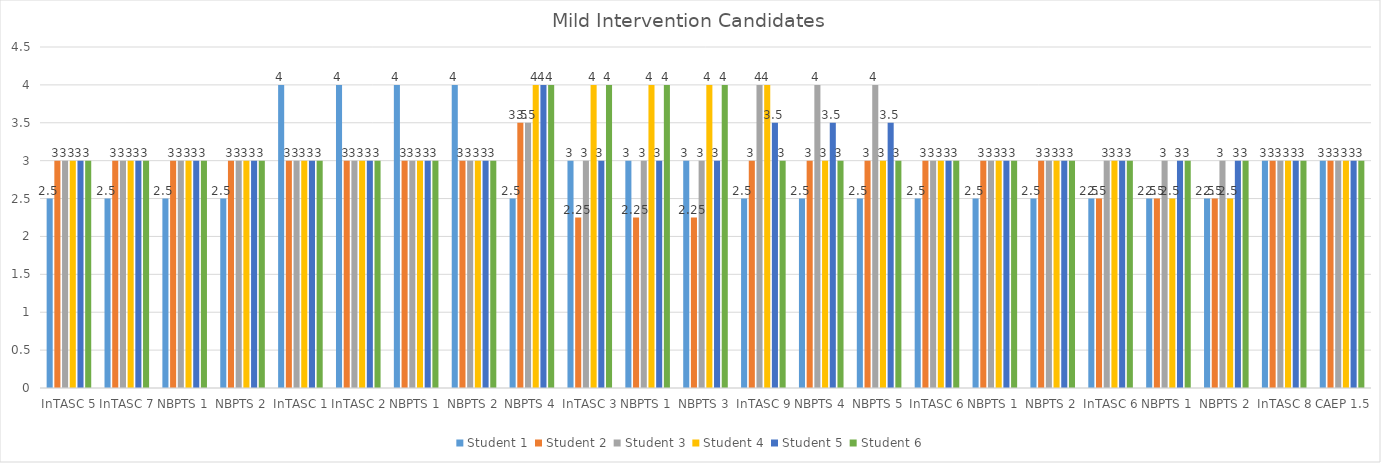
| Category | Student 1 | Student 2 | Student 3 | Student 4 | Student 5 | Student 6 |
|---|---|---|---|---|---|---|
| InTASC 5 | 2.5 | 3 | 3 | 3 | 3 | 3 |
| InTASC 7 | 2.5 | 3 | 3 | 3 | 3 | 3 |
| NBPTS 1 | 2.5 | 3 | 3 | 3 | 3 | 3 |
| NBPTS 2 | 2.5 | 3 | 3 | 3 | 3 | 3 |
| InTASC 1 | 4 | 3 | 3 | 3 | 3 | 3 |
| InTASC 2 | 4 | 3 | 3 | 3 | 3 | 3 |
| NBPTS 1 | 4 | 3 | 3 | 3 | 3 | 3 |
| NBPTS 2 | 4 | 3 | 3 | 3 | 3 | 3 |
| NBPTS 4 | 2.5 | 3.5 | 3.5 | 4 | 4 | 4 |
| InTASC 3 | 3 | 2.25 | 3 | 4 | 3 | 4 |
| NBPTS 1 | 3 | 2.25 | 3 | 4 | 3 | 4 |
| NBPTS 3 | 3 | 2.25 | 3 | 4 | 3 | 4 |
| InTASC 9 | 2.5 | 3 | 4 | 4 | 3.5 | 3 |
| NBPTS 4 | 2.5 | 3 | 4 | 3 | 3.5 | 3 |
| NBPTS 5 | 2.5 | 3 | 4 | 3 | 3.5 | 3 |
| InTASC 6 | 2.5 | 3 | 3 | 3 | 3 | 3 |
| NBPTS 1 | 2.5 | 3 | 3 | 3 | 3 | 3 |
| NBPTS 2 | 2.5 | 3 | 3 | 3 | 3 | 3 |
| InTASC 6 | 2.5 | 2.5 | 3 | 3 | 3 | 3 |
| NBPTS 1 | 2.5 | 2.5 | 3 | 2.5 | 3 | 3 |
| NBPTS 2 | 2.5 | 2.5 | 3 | 2.5 | 3 | 3 |
| InTASC 8 | 3 | 3 | 3 | 3 | 3 | 3 |
| CAEP 1.5 | 3 | 3 | 3 | 3 | 3 | 3 |